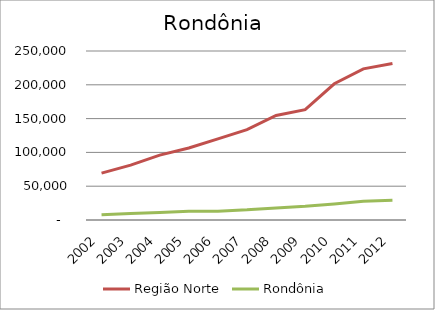
| Category | Região Norte | Rondônia |
|---|---|---|
| 2002.0 | 69309.957 | 7779.88 |
| 2003.0 | 81199.581 | 9750.818 |
| 2004.0 | 96012.341 | 11260.424 |
| 2005.0 | 106441.71 | 12884.047 |
| 2006.0 | 119993.429 | 13107.441 |
| 2007.0 | 133578.391 | 15002.734 |
| 2008.0 | 154703.433 | 17887.799 |
| 2009.0 | 163207.956 | 20236.194 |
| 2010.0 | 201510.748 | 23560.644 |
| 2011.0 | 223537.9 | 27839.144 |
| 2012.0 | 231383.089 | 29361.936 |